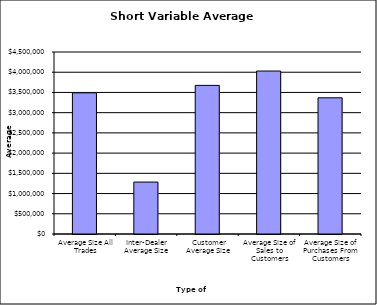
| Category | Security Type |
|---|---|
| Average Size All Trades | 3489911.887 |
| Inter-Dealer Average Size | 1283783.994 |
| Customer Average Size | 3674520.426 |
| Average Size of Sales to Customers | 4029504.818 |
| Average Size of Purchases From Customers | 3367577.415 |